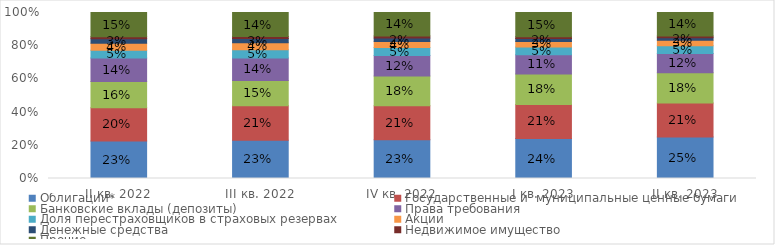
| Category | Облигации* | Государственные и  муниципальные ценные бумаги | Банковские вклады (депозиты) | Права требования | Доля перестраховщиков в страховых резервах | Акции  | Денежные средства | Недвижимое имущество | Прочие |
|---|---|---|---|---|---|---|---|---|---|
| II кв. 2022 | 0.226 | 0.2 | 0.159 | 0.141 | 0.048 | 0.042 | 0.026 | 0.012 | 0.146 |
| III кв. 2022 | 0.231 | 0.207 | 0.153 | 0.136 | 0.05 | 0.041 | 0.026 | 0.012 | 0.145 |
| IV кв. 2022 | 0.233 | 0.205 | 0.178 | 0.125 | 0.047 | 0.036 | 0.021 | 0.011 | 0.142 |
| I кв. 2023 | 0.241 | 0.206 | 0.184 | 0.115 | 0.047 | 0.034 | 0.018 | 0.011 | 0.145 |
| II кв. 2023 | 0.25 | 0.206 | 0.182 | 0.116 | 0.047 | 0.032 | 0.016 | 0.011 | 0.141 |